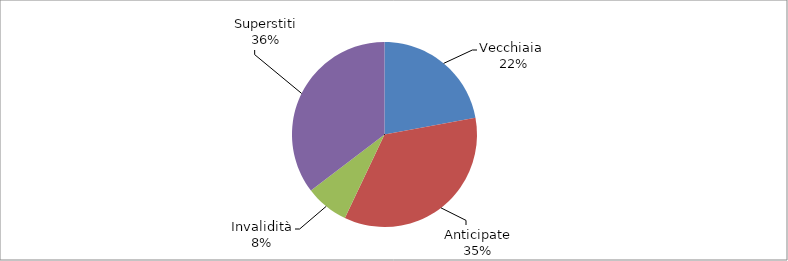
| Category | Series 0 |
|---|---|
| Vecchiaia  | 60258 |
| Anticipate | 95409 |
| Invalidità | 20734 |
| Superstiti | 96467 |